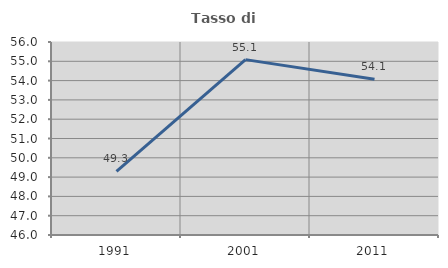
| Category | Tasso di occupazione   |
|---|---|
| 1991.0 | 49.291 |
| 2001.0 | 55.088 |
| 2011.0 | 54.072 |